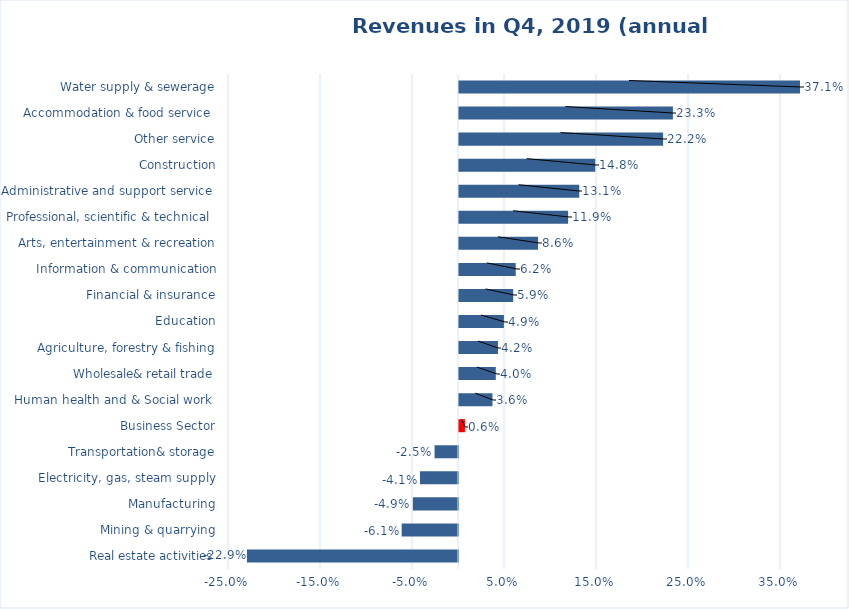
| Category | Series 1 |
|---|---|
| Real estate activities | -0.229 |
| Mining & quarrying | -0.061 |
| Manufacturing | -0.049 |
| Electricity, gas, steam supply | -0.041 |
| Transportation& storage | -0.025 |
| Business Sector | 0.006 |
| Human health and & Social work  | 0.036 |
| Wholesale& retail trade | 0.04 |
| Agriculture, forestry & fishing | 0.042 |
| Education | 0.049 |
| Financial & insurance | 0.059 |
| Information & communication | 0.062 |
| Arts, entertainment & recreation | 0.086 |
| Professional, scientific & technical  | 0.119 |
| Administrative and support service  | 0.131 |
| Construction | 0.148 |
| Other service | 0.222 |
| Accommodation & food service  | 0.233 |
| Water supply & sewerage | 0.371 |